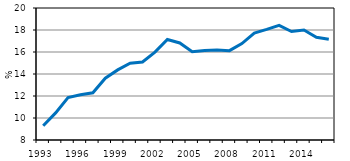
| Category | Series 0 | Series 1 |
|---|---|---|
| 1993.0 | 1993 | 9.298 |
| 1994.0 | 1994 | 10.464 |
| 1995.0 | 1995 | 11.856 |
| 1996.0 | 1996 | 12.115 |
| 1997.0 | 1997 | 12.297 |
| 1998.0 | 1998 | 13.618 |
| 1999.0 | 1999 | 14.374 |
| 2000.0 | 2000 | 14.982 |
| 2001.0 | 2001 | 15.093 |
| 2002.0 | 2002 | 15.993 |
| 2003.0 | 2003 | 17.136 |
| 2004.0 | 2004 | 16.824 |
| 2005.0 | 2005 | 16.02 |
| 2006.0 | 2006 | 16.138 |
| 2007.0 | 2007 | 16.172 |
| 2008.0 | 2008 | 16.122 |
| 2009.0 | 2009 | 16.767 |
| 2010.0 | 2010 | 17.725 |
| 2011.0 | 2011 | 18.051 |
| 2012.0 | 2012 | 18.416 |
| 2013.0 | 2013 | 17.863 |
| 2014.0 | 2014 | 17.993 |
| 2015.0 | 2015 | 17.339 |
| 2016.0 | 2016 | 17.159 |